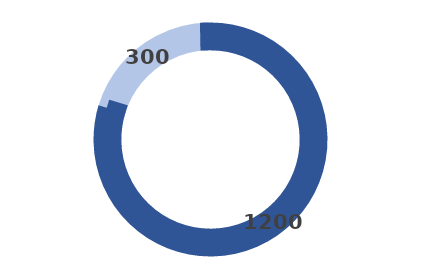
| Category | Series 0 |
|---|---|
| 0 | 300 |
| 1 | 1200 |